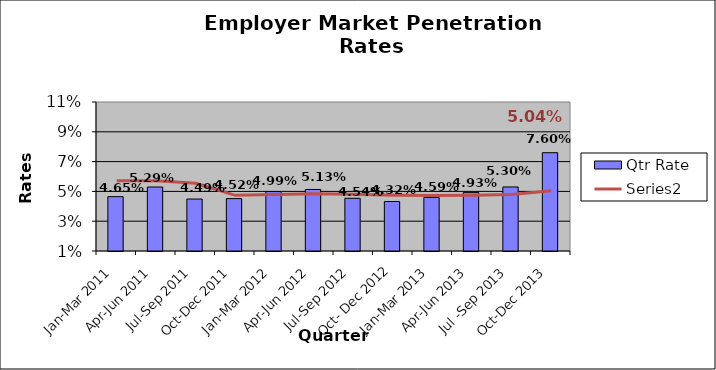
| Category | Qtr Rate |
|---|---|
| Jan-Mar 2011 | 0.046 |
| Apr-Jun 2011 | 0.053 |
| Jul-Sep 2011 | 0.045 |
| Oct-Dec 2011 | 0.045 |
| Jan-Mar 2012 | 0.05 |
| Apr-Jun 2012 | 0.051 |
| Jul-Sep 2012 | 0.045 |
| Oct- Dec 2012 | 0.043 |
| Jan-Mar 2013 | 0.046 |
| Apr-Jun 2013 | 0.049 |
| Jul -Sep 2013 | 0.053 |
| Oct-Dec 2013 | 0.076 |